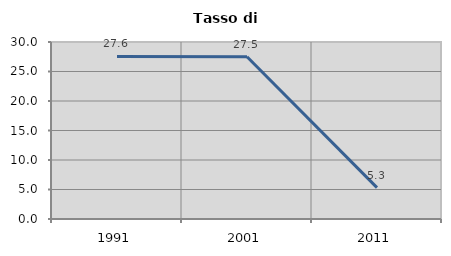
| Category | Tasso di disoccupazione   |
|---|---|
| 1991.0 | 27.563 |
| 2001.0 | 27.493 |
| 2011.0 | 5.312 |